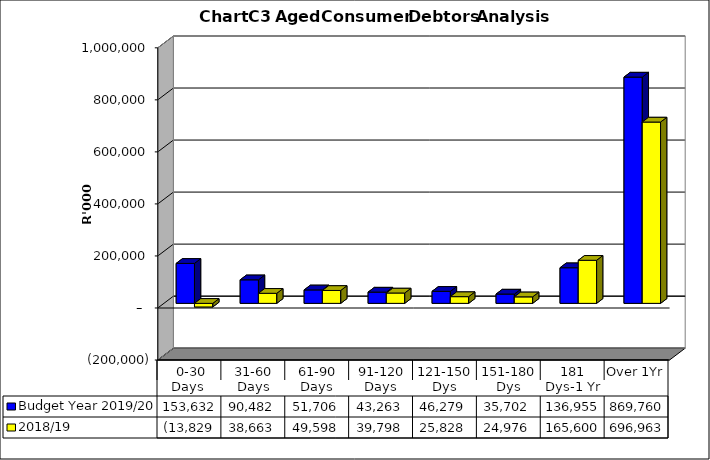
| Category | Budget Year 2019/20 | 2018/19 |
|---|---|---|
|  0-30 Days  | 153632237 | -13828769.66 |
| 31-60 Days | 90482460 | 38662682.56 |
| 61-90 Days | 51706277 | 49598237.34 |
| 91-120 Days | 43263299 | 39797862.6 |
| 121-150 Dys | 46278878 | 25827554.22 |
| 151-180 Dys | 35701544 | 24976130.53 |
| 181 Dys-1 Yr | 136954835 | 165599574.37 |
| Over 1Yr | 869759894 | 696963432.32 |